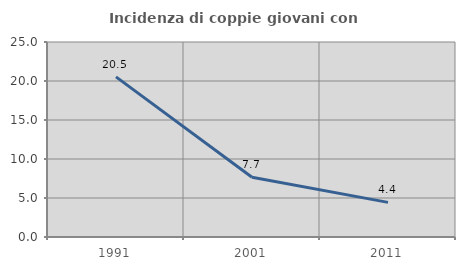
| Category | Incidenza di coppie giovani con figli |
|---|---|
| 1991.0 | 20.526 |
| 2001.0 | 7.666 |
| 2011.0 | 4.44 |